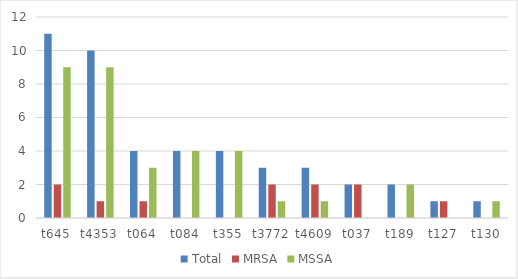
| Category | Total | MRSA | MSSA |
|---|---|---|---|
| t645 | 11 | 2 | 9 |
| t4353 | 10 | 1 | 9 |
| t064 | 4 | 1 | 3 |
| t084 | 4 | 0 | 4 |
| t355 | 4 | 0 | 4 |
| t3772 | 3 | 2 | 1 |
| t4609 | 3 | 2 | 1 |
| t037 | 2 | 2 | 0 |
| t189 | 2 | 0 | 2 |
| t127 | 1 | 1 | 0 |
| t130 | 1 | 0 | 1 |